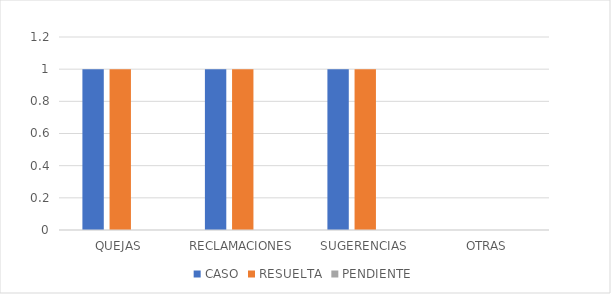
| Category | CASO | RESUELTA | PENDIENTE |
|---|---|---|---|
| QUEJAS | 1 | 1 | 0 |
| RECLAMACIONES | 1 | 1 | 0 |
| SUGERENCIAS | 1 | 1 | 0 |
| OTRAS | 0 | 0 | 0 |